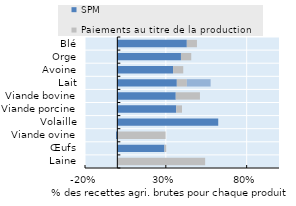
| Category | SPM | Paiements au titre de la production | Autres transferts au titre d'un seul produit |
|---|---|---|---|
| Laine | 0 | 0.543 | 0 |
| Œufs | 0.291 | 0.011 | 0 |
| Viande ovine | -0.008 | 0.298 | 0 |
| Volaille | 0.624 | 0 | 0 |
| Viande porcine | 0.364 | 0.036 | 0 |
| Viande bovine | 0.361 | 0.15 | 0 |
| Lait | 0.368 | 0.062 | 0.147 |
| Avoine | 0.345 | 0.063 | 0 |
| Orge | 0.394 | 0.064 | 0 |
| Blé | 0.43 | 0.063 | 0 |